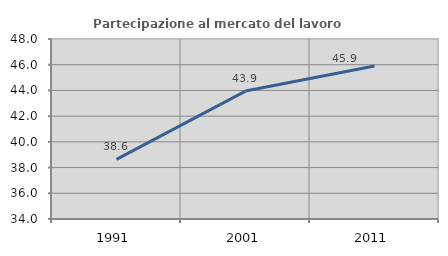
| Category | Partecipazione al mercato del lavoro  femminile |
|---|---|
| 1991.0 | 38.641 |
| 2001.0 | 43.948 |
| 2011.0 | 45.904 |